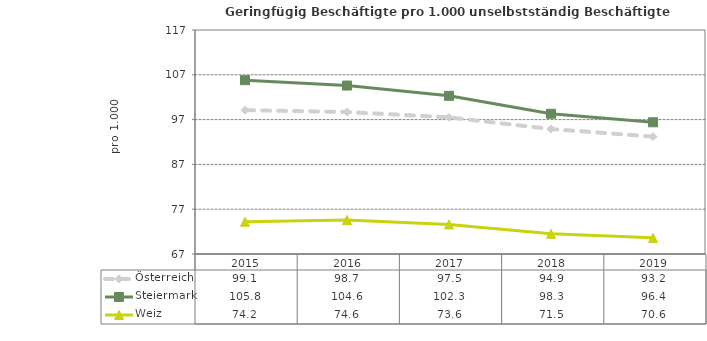
| Category | Österreich | Steiermark | Weiz |
|---|---|---|---|
| 2019.0 | 93.2 | 96.4 | 70.6 |
| 2018.0 | 94.9 | 98.3 | 71.5 |
| 2017.0 | 97.5 | 102.3 | 73.6 |
| 2016.0 | 98.7 | 104.6 | 74.6 |
| 2015.0 | 99.1 | 105.8 | 74.2 |